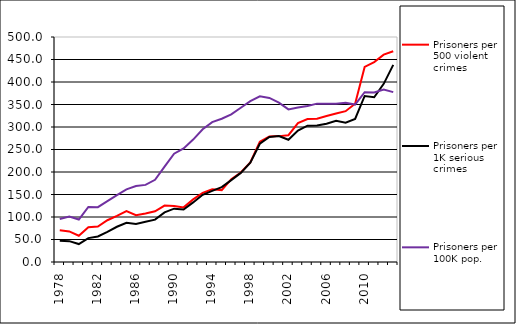
| Category | Prisoners per 500 violent crimes | Prisoners per 1K serious crimes | Prisoners per 100K pop. |
|---|---|---|---|
| 1978.0 | 70.744 | 47.228 | 95.748 |
| 1979.0 | 67.997 | 46.312 | 101.167 |
| 1980.0 | 58.44 | 39.888 | 94.442 |
| 1981.0 | 77.125 | 53.057 | 122.244 |
| 1982.0 | 78.68 | 56.722 | 121.847 |
| 1983.0 | 92.803 | 66.884 | 135.138 |
| 1984.0 | 102.552 | 78.322 | 148.675 |
| 1985.0 | 113.005 | 87.294 | 161.543 |
| 1986.0 | 104.094 | 84.68 | 168.699 |
| 1987.0 | 107.628 | 89.268 | 171.387 |
| 1988.0 | 112.664 | 94.175 | 182.614 |
| 1989.0 | 125.3 | 110.296 | 211.975 |
| 1990.0 | 124.422 | 118.562 | 240.722 |
| 1991.0 | 121.358 | 116.816 | 252.231 |
| 1992.0 | 139.182 | 132.402 | 272.032 |
| 1993.0 | 153.639 | 149.298 | 294.905 |
| 1994.0 | 161.745 | 158.113 | 310.849 |
| 1995.0 | 159.79 | 166.341 | 318.326 |
| 1996.0 | 184.164 | 181.834 | 327.948 |
| 1997.0 | 199.012 | 197.975 | 342.872 |
| 1998.0 | 221.249 | 220.68 | 357.418 |
| 1999.0 | 267.038 | 262.802 | 368.228 |
| 2000.0 | 278.838 | 277.719 | 364.602 |
| 2001.0 | 279.728 | 279.925 | 354.211 |
| 2002.0 | 281.769 | 271.586 | 339.198 |
| 2003.0 | 308.472 | 291.943 | 343.25 |
| 2004.0 | 317.552 | 302.874 | 346.554 |
| 2005.0 | 318.593 | 303.238 | 351.88 |
| 2006.0 | 324.513 | 307.352 | 351.513 |
| 2007.0 | 329.902 | 313.88 | 351.798 |
| 2008.0 | 335.156 | 309.752 | 354.077 |
| 2009.0 | 351.803 | 317.957 | 349.803 |
| 2010.0 | 433.581 | 368.944 | 377.363 |
| 2011.0 | 444.097 | 366.2 | 376.578 |
| 2012.0 | 460.714 | 395.873 | 383.488 |
| 2013.0 | 468.213 | 438.122 | 377.431 |